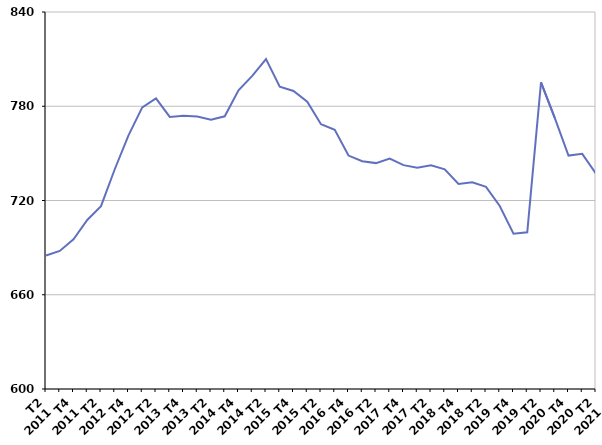
| Category | Moins de 25 ans |
|---|---|
| T2
2011 | 685 |
| T3
2011 | 687.9 |
| T4
2011 | 695.3 |
| T1
2012 | 707.6 |
| T2
2012 | 716.4 |
| T3
2012 | 739.9 |
| T4
2012 | 761.5 |
| T1
2013 | 779.3 |
| T2
2013 | 785 |
| T3
2013 | 773.2 |
| T4
2013 | 773.9 |
| T1
2014 | 773.4 |
| T2
2014 | 771.4 |
| T3
2014 | 773.6 |
| T4
2014 | 790.2 |
| T1
2015 | 799.3 |
| T2
2015 | 810 |
| T3
2015 | 792.5 |
| T4
2015 | 789.7 |
| T1
2016 | 782.9 |
| T2
2016 | 768.6 |
| T3
2016 | 765 |
| T4
2016 | 748.6 |
| T1
2017 | 745 |
| T2
2017 | 743.8 |
| T3
2017 | 746.7 |
| T4
2017 | 742.5 |
| T1
2018 | 740.9 |
| T2
2018 | 742.4 |
| T3
2018 | 739.8 |
| T4
2018 | 730.5 |
| T1
2019 | 731.6 |
| T2
2019 | 728.7 |
| T3
2019 | 716.5 |
| T4
2019 | 698.8 |
| T1
2020 | 699.8 |
| T2
2020 | 795.2 |
| T3
2020 | 772.6 |
| T4
2020 | 748.6 |
| T1
2021 | 749.7 |
| T2
2021 | 737.1 |